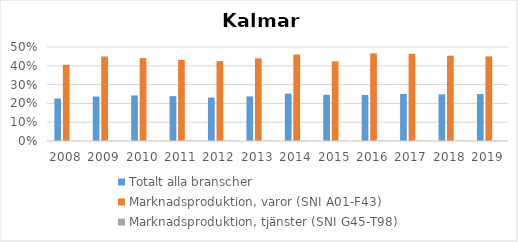
| Category | Totalt alla branscher | Marknadsproduktion, varor (SNI A01-F43) | Marknadsproduktion, tjänster (SNI G45-T98) |
|---|---|---|---|
| 2008 | 0.226 | 0.405 | 0.002 |
| 2009 | 0.236 | 0.45 | 0.002 |
| 2010 | 0.242 | 0.441 | 0.002 |
| 2011 | 0.239 | 0.431 | 0.002 |
| 2012 | 0.231 | 0.425 | 0.002 |
| 2013 | 0.237 | 0.44 | 0.002 |
| 2014 | 0.252 | 0.46 | 0.002 |
| 2015 | 0.246 | 0.424 | 0.002 |
| 2016 | 0.245 | 0.466 | 0.002 |
| 2017 | 0.25 | 0.463 | 0.002 |
| 2018 | 0.248 | 0.454 | 0.002 |
| 2019 | 0.25 | 0.45 | 0.002 |